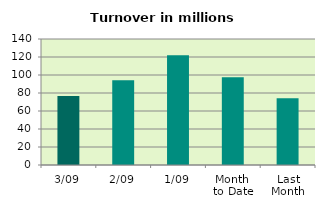
| Category | Series 0 |
|---|---|
| 3/09 | 76.601 |
| 2/09 | 94.147 |
| 1/09 | 121.849 |
| Month 
to Date | 97.532 |
| Last
Month | 74.221 |